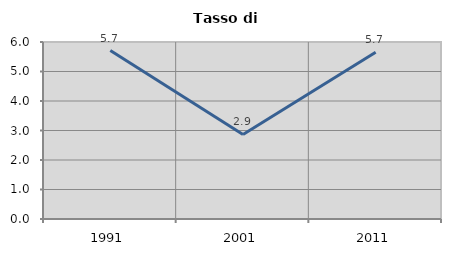
| Category | Tasso di disoccupazione   |
|---|---|
| 1991.0 | 5.71 |
| 2001.0 | 2.868 |
| 2011.0 | 5.654 |